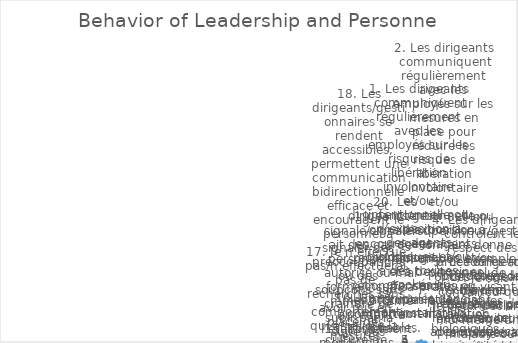
| Category | Series 0 |
|---|---|
| 1. Les dirigeants communiquent régulièrement avec les employés sur les risques de libération involontaire et/ou intentionnelle ou d’exposition à des agents biologiques et/ou à des toxines stockés ou manipulés dans mon installation. | 2 |
| 2. Les dirigeants communiquent régulièrement avec les employés sur les mesures en place pour réduire les risques de libération involontaire et/ou intentionnelle ou d’exposition à des agents biologiques et/ou à des toxines stockés ou manipulés dans mon ins | 4 |
| 3. Mon superviseur/gestionnaire donne un bon exemple personnel de pratiques visant à réduire les risques biologiques. | 0 |
| 4. Les dirigeants contrôlent le respect des procédures (ou protocoles de recherche) et des règles de conduite approuvées/validées. | 5 |
| 5. Les dirigeants fournissent les moyens nécessaires pour mettre en œuvre des mesures de biosécurité et de biosûreté. | 1 |
| 6. Les dirigeants de mon organisation encouragent les employés à accroître leur éducation et leur sensibilisation aux risques biologiques. | 4 |
| 7. Je suis convaincu que je peux déclarer moi-même une maladie ou d’autres conditions susceptibles d’affecter la biosécurité/biosûreté sans crainte de perdre mon emploi ni d’autres effets négatifs sur ma vie professionnelle/ma carrière.  | 2 |
| 8. Il n’est jamais approprié de suivre (« ferroutage ») un employé autorisé à entrer dans une zone réglementée. | 3 |
| 9. Je signale/signalerait un comportement inhabituel de mes collègues qui augmente le risque de libération involontaire et/ou intentionnelle d’agents biologiques et/ou de toxines, ou d’exposition à ces agents. | 2 |
| 10. Je suis engagé dans les processus d’évaluation des risques et de prise de décision pour réduire le risque de libération involontaire et/ou intentionnelle d’agents biologiques et/ou de toxines stockés ou manipulés dans mon installation. | 0 |
| 11. Mon organisation valorise la vigilance en matière de biosécurité et de biosûreté. | 2 |
| 12. Dans mon organisation, des mesures sont en place pour punir les violations délibérées de la biosécurité et de la biosûreté. | 1 |
| 13. Les dirigeants communiquent avec le personnel sur les attentes de performance spécifiques dans les domaines qui affectent la biosécurité et la biosûreté. | 4 |
| 14. Les employés participent aux processus d’évaluation des risques et de prise de décision et aux autres activités qui les concernent.  | 0 |
| 15. Tout le monde dans mon installation dispose correctement des matériaux contaminés. | 1 |
| 16. Un comportement qui améliore la culture de biosécurité et de biosûreté est renforcé par mes pairs. | 1 |
| 17. Je n’effectue pas/n’effectuerai pas de recherches sans avoir mis en place des mesures appropriées d’atténuation de risques. | 2 |
| 18. Les dirigeants/gestionnaires se rendent accessibles, permettent une communication bidirectionnelle efficace et encouragent le personnel à signaler des préoccupations ou des soupçons sans craindre de subir par la suite des mesures disciplinaires4. | 0 |
| 19. Je signale/signalerait des cas de personnel non autorisé ou mal formé/insuffisamment formé accédant à l’établissement.  | 1 |
| 20. Les dirigeants/gestionnaires encouragent, reconnaissent et récompensent les attitudes et comportements louables. | 3 |